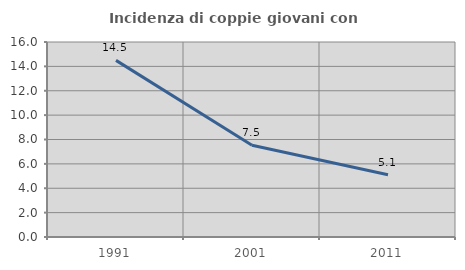
| Category | Incidenza di coppie giovani con figli |
|---|---|
| 1991.0 | 14.493 |
| 2001.0 | 7.531 |
| 2011.0 | 5.106 |